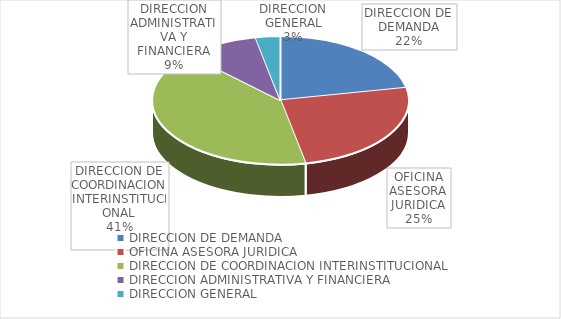
| Category | Series 0 |
|---|---|
| DIRECCION DE DEMANDA | 7 |
| OFICINA ASESORA JURIDICA | 8 |
| DIRECCION DE COORDINACION INTERINSTITUCIONAL | 13 |
| DIRECCION ADMINISTRATIVA Y FINANCIERA | 3 |
| DIRECCION GENERAL | 1 |